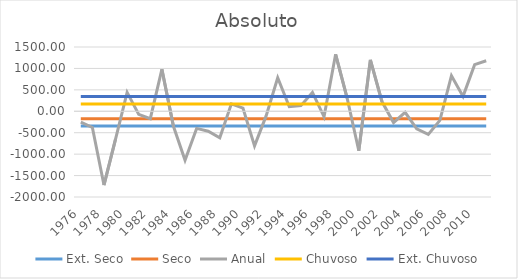
| Category | Ext. Seco | Seco | Anual | Chuvoso | Ext. Chuvoso |
|---|---|---|---|---|---|
| 1976.0 | -345.121 | -172.56 | -251.422 | 172.56 | 345.121 |
| 1977.0 | -345.121 | -172.56 | -377.222 | 172.56 | 345.121 |
| 1978.0 | -345.121 | -172.56 | -1721.822 | 172.56 | 345.121 |
| 1979.0 | -345.121 | -172.56 | -650.222 | 172.56 | 345.121 |
| 1980.0 | -345.121 | -172.56 | 440.578 | 172.56 | 345.121 |
| 1981.0 | -345.121 | -172.56 | -72.422 | 172.56 | 345.121 |
| 1982.0 | -345.121 | -172.56 | -172.222 | 172.56 | 345.121 |
| 1983.0 | -345.121 | -172.56 | 979.778 | 172.56 | 345.121 |
| 1984.0 | -345.121 | -172.56 | -351.022 | 172.56 | 345.121 |
| 1985.0 | -345.121 | -172.56 | -1143.822 | 172.56 | 345.121 |
| 1986.0 | -345.121 | -172.56 | -399.422 | 172.56 | 345.121 |
| 1987.0 | -345.121 | -172.56 | -464.422 | 172.56 | 345.121 |
| 1988.0 | -345.121 | -172.56 | -617.622 | 172.56 | 345.121 |
| 1989.0 | -345.121 | -172.56 | 173.778 | 172.56 | 345.121 |
| 1990.0 | -345.121 | -172.56 | 75.378 | 172.56 | 345.121 |
| 1991.0 | -345.121 | -172.56 | -805.822 | 172.56 | 345.121 |
| 1992.0 | -345.121 | -172.56 | -107.622 | 172.56 | 345.121 |
| 1993.0 | -345.121 | -172.56 | 781.178 | 172.56 | 345.121 |
| 1994.0 | -345.121 | -172.56 | 106.978 | 172.56 | 345.121 |
| 1995.0 | -345.121 | -172.56 | 131.578 | 172.56 | 345.121 |
| 1996.0 | -345.121 | -172.56 | 440.378 | 172.56 | 345.121 |
| 1997.0 | -345.121 | -172.56 | -128.622 | 172.56 | 345.121 |
| 1998.0 | -345.121 | -172.56 | 1330.178 | 172.56 | 345.121 |
| 1999.0 | -345.121 | -172.56 | 300.978 | 172.56 | 345.121 |
| 2000.0 | -345.121 | -172.56 | -920.822 | 172.56 | 345.121 |
| 2001.0 | -345.121 | -172.56 | 1199.578 | 172.56 | 345.121 |
| 2002.0 | -345.121 | -172.56 | 226.378 | 172.56 | 345.121 |
| 2003.0 | -345.121 | -172.56 | -262.222 | 172.56 | 345.121 |
| 2004.0 | -345.121 | -172.56 | -23.022 | 172.56 | 345.121 |
| 2005.0 | -345.121 | -172.56 | -410.422 | 172.56 | 345.121 |
| 2006.0 | -345.121 | -172.56 | -540.622 | 172.56 | 345.121 |
| 2007.0 | -345.121 | -172.56 | -212.022 | 172.56 | 345.121 |
| 2008.0 | -345.121 | -172.56 | 831.578 | 172.56 | 345.121 |
| 2009.0 | -345.121 | -172.56 | 347.778 | 172.56 | 345.121 |
| 2010.0 | -345.121 | -172.56 | 1088.178 | 172.56 | 345.121 |
| 2011.0 | -345.121 | -172.56 | 1178.578 | 172.56 | 345.121 |